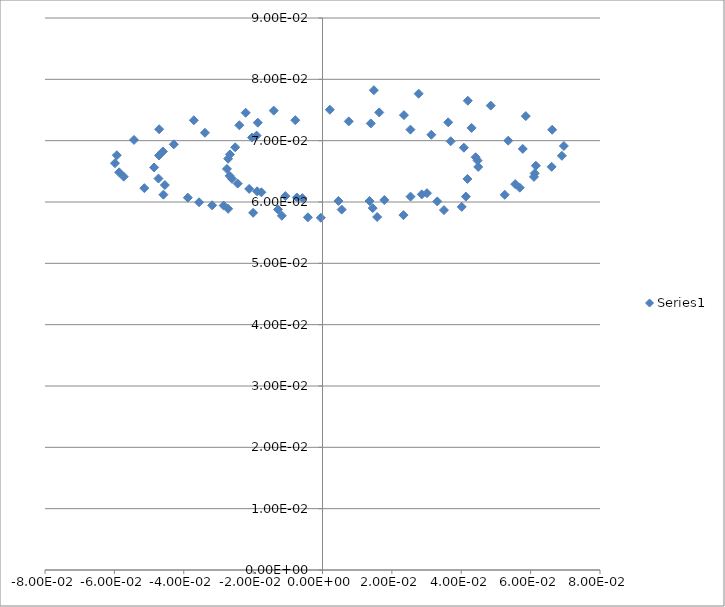
| Category | Series 0 |
|---|---|
| 0.0148141999 | 0.078 |
| 0.0277181827 | 0.078 |
| 0.0418849774 | 0.077 |
| 0.0485020652 | 0.076 |
| 0.0586072057 | 0.074 |
| 0.0662093312 | 0.072 |
| 0.0695760101 | 0.069 |
| 0.0690100864 | 0.068 |
| 0.0660567582 | 0.066 |
| 0.0609604754 | 0.064 |
| 0.0555499643 | 0.063 |
| 0.0413271263 | 0.061 |
| 0.0330942422 | 0.06 |
| 0.0144742709 | 0.059 |
| 0.00553096551 | 0.059 |
| -0.0128312996 | 0.059 |
| -0.0284914896 | 0.059 |
| -0.035584446 | 0.06 |
| -0.0458692834 | 0.061 |
| -0.0513604321 | 0.062 |
| -0.057320036 | 0.064 |
| -0.0586196594 | 0.065 |
| -0.0598234795 | 0.066 |
| -0.0592990145 | 0.068 |
| -0.0543494448 | 0.07 |
| -0.0470845401 | 0.072 |
| -0.0370892324 | 0.073 |
| -0.0221458934 | 0.075 |
| -0.0140553545 | 0.075 |
| 0.00211261772 | 0.075 |
| 0.0163517259 | 0.075 |
| 0.0234725028 | 0.074 |
| 0.0362432748 | 0.073 |
| 0.0429814979 | 0.072 |
| 0.0535457134 | 0.07 |
| 0.0577364378 | 0.069 |
| 0.0615128502 | 0.066 |
| 0.0611754097 | 0.065 |
| 0.0568555519 | 0.062 |
| 0.0525399745 | 0.061 |
| 0.0401425399 | 0.059 |
| 0.0350094885 | 0.059 |
| 0.0233395174 | 0.058 |
| 0.0157594811 | 0.058 |
| -0.000484954566 | 0.057 |
| -0.00420938805 | 0.057 |
| -0.0117256837 | 0.058 |
| -0.019997783 | 0.058 |
| -0.0272004157 | 0.059 |
| -0.0318078138 | 0.059 |
| -0.0388239548 | 0.061 |
| -0.0454454422 | 0.063 |
| -0.0472894609 | 0.064 |
| -0.0485393927 | 0.066 |
| -0.0471188314 | 0.068 |
| -0.0460073538 | 0.068 |
| -0.0428690389 | 0.069 |
| -0.0338916853 | 0.071 |
| -0.0239802096 | 0.073 |
| -0.0186595228 | 0.073 |
| -0.00784843136 | 0.073 |
| 0.0075667426 | 0.073 |
| 0.0139277019 | 0.073 |
| 0.0253375862 | 0.072 |
| 0.0313702375 | 0.071 |
| 0.0369553901 | 0.07 |
| 0.0407562405 | 0.069 |
| 0.0441448316 | 0.067 |
| 0.0447012745 | 0.067 |
| 0.0448946767 | 0.066 |
| 0.0417795777 | 0.064 |
| 0.0301127471 | 0.061 |
| 0.0286235008 | 0.061 |
| 0.0253866632 | 0.061 |
| 0.0178223625 | 0.06 |
| 0.0135510061 | 0.06 |
| 0.00460068509 | 0.06 |
| -0.00580539089 | 0.061 |
| -0.00740627665 | 0.061 |
| -0.0107140988 | 0.061 |
| -0.0176120698 | 0.062 |
| -0.0188446511 | 0.062 |
| -0.0211401526 | 0.062 |
| -0.0244513899 | 0.063 |
| -0.0260687545 | 0.064 |
| -0.02676313 | 0.064 |
| -0.027554309 | 0.065 |
| -0.0272034369 | 0.067 |
| -0.0266874544 | 0.068 |
| -0.0251622759 | 0.069 |
| -0.0203343481 | 0.071 |
| -0.0189999994 | 0.071 |